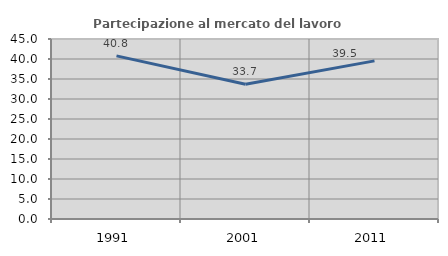
| Category | Partecipazione al mercato del lavoro  femminile |
|---|---|
| 1991.0 | 40.777 |
| 2001.0 | 33.673 |
| 2011.0 | 39.535 |